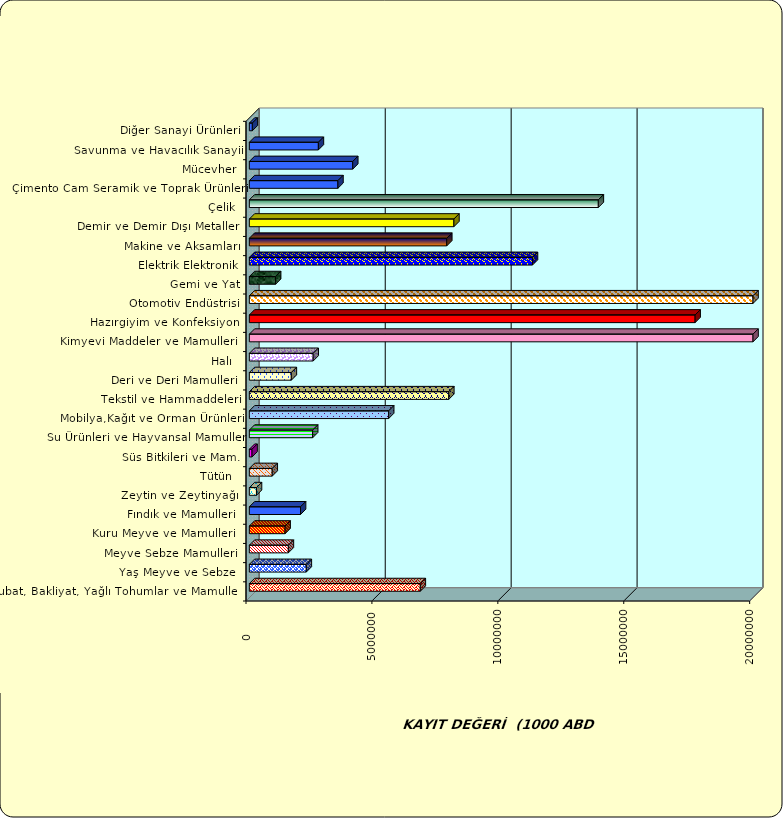
| Category | Series 0 |
|---|---|
|  Hububat, Bakliyat, Yağlı Tohumlar ve Mamulleri  | 6788340.718 |
|  Yaş Meyve ve Sebze   | 2261328.971 |
|  Meyve Sebze Mamulleri  | 1549301.142 |
|  Kuru Meyve ve Mamulleri   | 1418873.162 |
|  Fındık ve Mamulleri  | 2032479.341 |
|  Zeytin ve Zeytinyağı  | 282709.161 |
|  Tütün  | 909067.171 |
|  Süs Bitkileri ve Mam. | 106491.178 |
|  Su Ürünleri ve Hayvansal Mamuller | 2514131.746 |
|  Mobilya,Kağıt ve Orman Ürünleri | 5531789.598 |
|  Tekstil ve Hammaddeleri | 7919728.175 |
|  Deri ve Deri Mamulleri  | 1666925.824 |
|  Halı  | 2535244.659 |
|  Kimyevi Maddeler ve Mamulleri   | 20570444.491 |
|  Hazırgiyim ve Konfeksiyon  | 17700868.706 |
|  Otomotiv Endüstrisi | 30594198.409 |
|  Gemi ve Yat | 1042325.895 |
|  Elektrik Elektronik | 11242644.651 |
|  Makine ve Aksamları | 7839001.487 |
|  Demir ve Demir Dışı Metaller  | 8122815.777 |
|  Çelik | 13857739.143 |
|  Çimento Cam Seramik ve Toprak Ürünleri | 3517037.09 |
|  Mücevher | 4105432.807 |
|  Savunma ve Havacılık Sanayii | 2740988.087 |
|  Diğer Sanayi Ürünleri | 119197.654 |